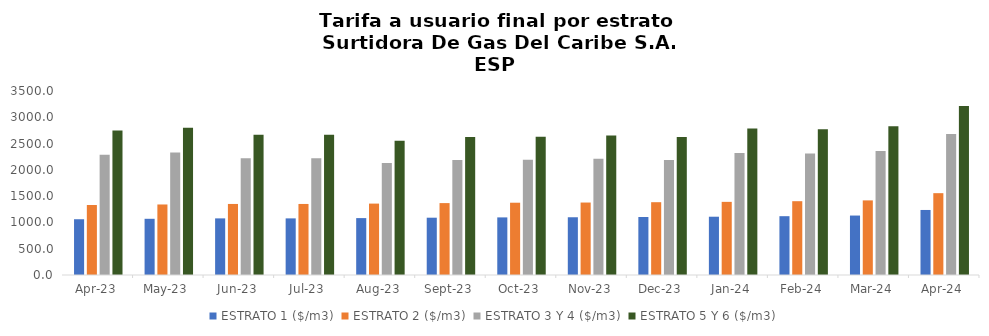
| Category | ESTRATO 1 ($/m3) | ESTRATO 2 ($/m3) | ESTRATO 3 Y 4 ($/m3) | ESTRATO 5 Y 6 ($/m3) |
|---|---|---|---|---|
| 2023-04-01 | 1060.8 | 1331.1 | 2289.32 | 2747.184 |
| 2023-05-01 | 1069.09 | 1341.51 | 2332.27 | 2798.724 |
| 2023-06-01 | 1076.98 | 1351.41 | 2221.89 | 2666.268 |
| 2023-07-01 | 1076.98 | 1351.41 | 2221.89 | 2666.268 |
| 2023-08-01 | 1082.37 | 1358.18 | 2129.89 | 2555.868 |
| 2023-09-01 | 1089.94 | 1367.67 | 2187.17 | 2624.604 |
| 2023-10-01 | 1095.74 | 1374.95 | 2190.44 | 2628.528 |
| 2023-11-01 | 1098.48 | 1378.38 | 2212.27 | 2654.724 |
| 2023-12-01 | 1103.63 | 1384.85 | 2189.08 | 2626.896 |
| 2024-01-01 | 1108.7 | 1391.21 | 2321.9 | 2786.28 |
| 2024-02-01 | 1118.84 | 1403.94 | 2309.92 | 2771.904 |
| 2024-03-01 | 1131 | 1419.19 | 2356.74 | 2828.088 |
| 2024-04-01 | 1237.07 | 1556.63 | 2680.45 | 3216.54 |